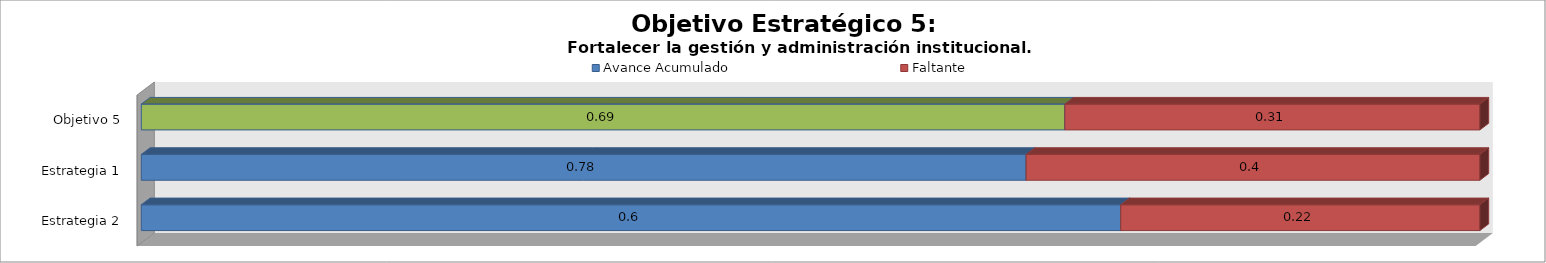
| Category | Avance Acumulado | Faltante |
|---|---|---|
| Estrategia 2 | 0.6 | 0.22 |
| Estrategia 1 | 0.78 | 0.4 |
| Objetivo 5 | 0.69 | 0.31 |